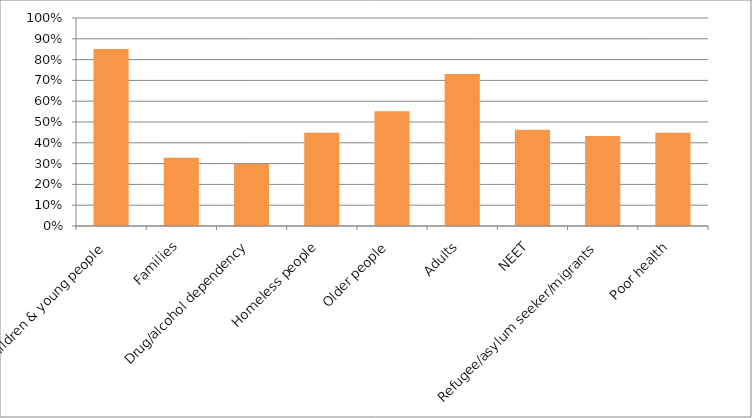
| Category | Series 0 |
|---|---|
| Children & young people | 0.851 |
| Families | 0.328 |
| Drug/alcohol dependency | 0.299 |
| Homeless people | 0.448 |
| Older people | 0.552 |
| Adults | 0.731 |
| NEET | 0.463 |
| Refugee/asylum seeker/migrants | 0.433 |
| Poor health | 0.448 |